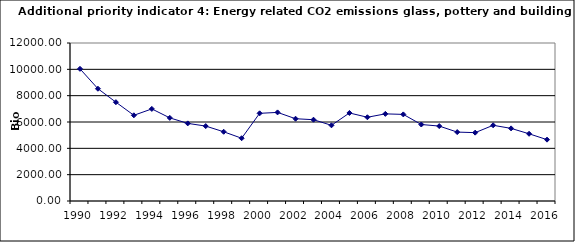
| Category | Energy related CO2 emissions glass, pottery and building materials, kt |
|---|---|
| 1990 | 10038.446 |
| 1991 | 8526.893 |
| 1992 | 7505.479 |
| 1993 | 6508.81 |
| 1994 | 6994.038 |
| 1995 | 6312.66 |
| 1996 | 5894.729 |
| 1997 | 5689.333 |
| 1998 | 5257.576 |
| 1999 | 4767.593 |
| 2000 | 6657.469 |
| 2001 | 6729.653 |
| 2002 | 6248.575 |
| 2003 | 6173.785 |
| 2004 | 5748.453 |
| 2005 | 6686.896 |
| 2006 | 6359.855 |
| 2007 | 6617.185 |
| 2008 | 6576.881 |
| 2009 | 5808.965 |
| 2010 | 5690.39 |
| 2011 | 5233.968 |
| 2012 | 5190.713 |
| 2013 | 5750.061 |
| 2014 | 5515.222 |
| 2015 | 5105.12 |
| 2016 | 4659.86 |